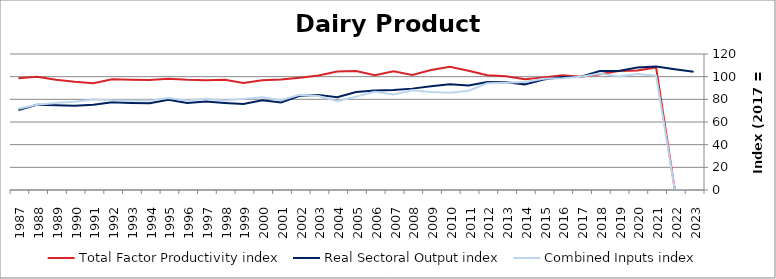
| Category | Total Factor Productivity index | Real Sectoral Output index | Combined Inputs index |
|---|---|---|---|
| 2023.0 | 0 | 104.354 | 0 |
| 2022.0 | 0 | 106.575 | 0 |
| 2021.0 | 108.083 | 109.069 | 100.912 |
| 2020.0 | 105.521 | 108.059 | 102.406 |
| 2019.0 | 105.045 | 105.096 | 100.049 |
| 2018.0 | 102.087 | 104.898 | 102.754 |
| 2017.0 | 100 | 100 | 100 |
| 2016.0 | 101.149 | 99.694 | 98.562 |
| 2015.0 | 99.307 | 97.491 | 98.172 |
| 2014.0 | 97.806 | 93.205 | 95.296 |
| 2013.0 | 100.427 | 95.095 | 94.691 |
| 2012.0 | 101.285 | 95.352 | 94.142 |
| 2011.0 | 105.24 | 92.255 | 87.661 |
| 2010.0 | 108.814 | 93.391 | 85.827 |
| 2009.0 | 105.801 | 91.494 | 86.478 |
| 2008.0 | 101.53 | 89.445 | 88.098 |
| 2007.0 | 104.729 | 88.214 | 84.231 |
| 2006.0 | 101.353 | 87.759 | 86.588 |
| 2005.0 | 105.01 | 86.54 | 82.412 |
| 2004.0 | 104.647 | 81.89 | 78.253 |
| 2003.0 | 101.111 | 83.931 | 83.009 |
| 2002.0 | 99.109 | 83.195 | 83.943 |
| 2001.0 | 97.467 | 77.158 | 79.163 |
| 2000.0 | 96.919 | 79.26 | 81.78 |
| 1999.0 | 94.435 | 75.928 | 80.402 |
| 1998.0 | 97.241 | 76.796 | 78.974 |
| 1997.0 | 96.914 | 78.03 | 80.515 |
| 1996.0 | 97.251 | 76.845 | 79.017 |
| 1995.0 | 98.209 | 79.663 | 81.115 |
| 1994.0 | 97.084 | 76.563 | 78.862 |
| 1993.0 | 97.356 | 76.869 | 78.957 |
| 1992.0 | 97.753 | 77.459 | 79.24 |
| 1991.0 | 94.152 | 75.238 | 79.911 |
| 1990.0 | 95.491 | 74.414 | 77.928 |
| 1989.0 | 97.37 | 74.725 | 76.744 |
| 1988.0 | 99.996 | 75.147 | 75.15 |
| 1987.0 | 98.685 | 70.666 | 71.607 |